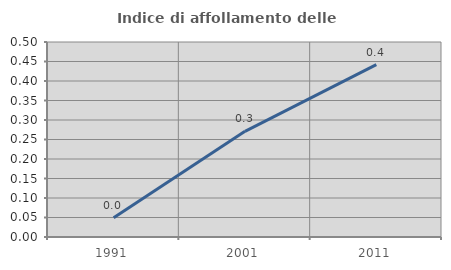
| Category | Indice di affollamento delle abitazioni  |
|---|---|
| 1991.0 | 0.049 |
| 2001.0 | 0.271 |
| 2011.0 | 0.442 |